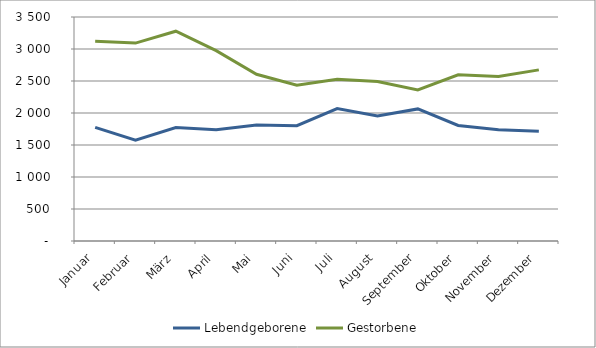
| Category | Lebendgeborene | Gestorbene |
|---|---|---|
| Januar | 1775 | 3122 |
| Februar | 1575 | 3092 |
| März | 1774 | 3278 |
| April | 1739 | 2974 |
| Mai | 1814 | 2605 |
| Juni | 1802 | 2433 |
| Juli | 2069 | 2529 |
| August | 1952 | 2493 |
| September | 2064 | 2361 |
| Oktober | 1805 | 2598 |
| November | 1738 | 2570 |
| Dezember | 1715 | 2674 |